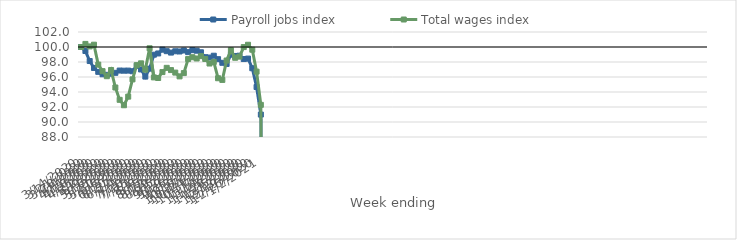
| Category | Payroll jobs index | Total wages index |
|---|---|---|
| 14/03/2020 | 100 | 100 |
| 21/03/2020 | 99.467 | 100.412 |
| 28/03/2020 | 98.13 | 100.077 |
| 04/04/2020 | 97.206 | 100.308 |
| 11/04/2020 | 96.687 | 97.649 |
| 18/04/2020 | 96.368 | 96.78 |
| 25/04/2020 | 96.292 | 96.106 |
| 02/05/2020 | 96.434 | 96.937 |
| 09/05/2020 | 96.558 | 94.6 |
| 16/05/2020 | 96.858 | 92.957 |
| 23/05/2020 | 96.844 | 92.235 |
| 30/05/2020 | 96.852 | 93.382 |
| 06/06/2020 | 96.768 | 95.685 |
| 13/06/2020 | 97.498 | 97.582 |
| 20/06/2020 | 97.004 | 97.822 |
| 27/06/2020 | 96.053 | 96.981 |
| 04/07/2020 | 97.114 | 99.829 |
| 11/07/2020 | 98.975 | 95.948 |
| 18/07/2020 | 99.139 | 95.867 |
| 25/07/2020 | 99.644 | 96.655 |
| 01/08/2020 | 99.443 | 97.223 |
| 08/08/2020 | 99.255 | 96.922 |
| 15/08/2020 | 99.429 | 96.586 |
| 22/08/2020 | 99.401 | 96.083 |
| 29/08/2020 | 99.534 | 96.522 |
| 05/09/2020 | 99.315 | 98.39 |
| 12/09/2020 | 99.583 | 98.639 |
| 19/09/2020 | 99.506 | 98.468 |
| 26/09/2020 | 99.298 | 98.78 |
| 03/10/2020 | 98.642 | 98.401 |
| 10/10/2020 | 98.594 | 97.797 |
| 17/10/2020 | 98.836 | 98.006 |
| 24/10/2020 | 98.379 | 95.835 |
| 31/10/2020 | 97.893 | 95.612 |
| 07/11/2020 | 97.739 | 98.199 |
| 14/11/2020 | 98.981 | 99.576 |
| 21/11/2020 | 98.806 | 98.563 |
| 28/11/2020 | 98.838 | 98.718 |
| 05/12/2020 | 98.397 | 99.989 |
| 12/12/2020 | 98.456 | 100.298 |
| 19/12/2020 | 97.17 | 99.638 |
| 26/12/2020 | 94.665 | 96.715 |
| 02/01/2021 | 90.99 | 92.288 |